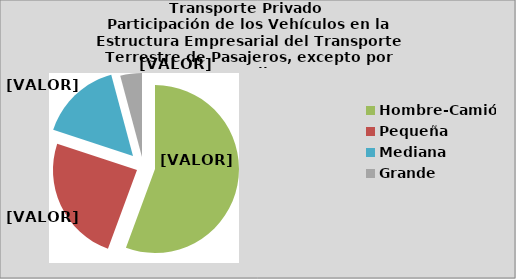
| Category | Series 0 |
|---|---|
| Hombre-Camión | 55.621 |
| Pequeña | 24.425 |
| Mediana | 15.779 |
| Grande | 4.175 |